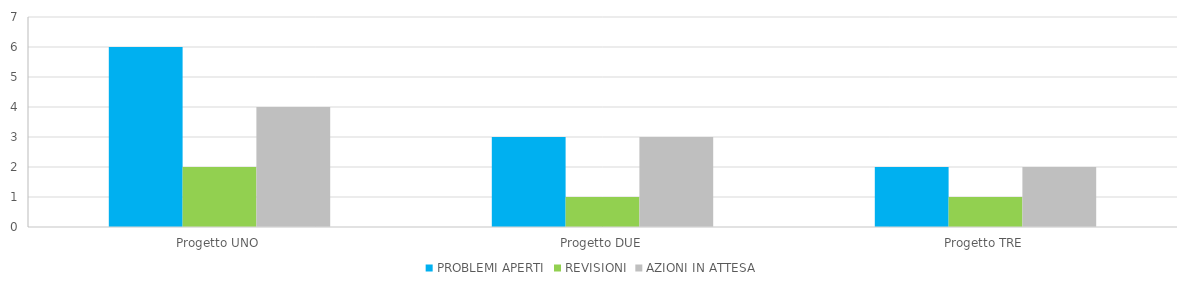
| Category | PROBLEMI APERTI | REVISIONI | AZIONI IN ATTESA |
|---|---|---|---|
| Progetto UNO | 6 | 2 | 4 |
| Progetto DUE | 3 | 1 | 3 |
| Progetto TRE | 2 | 1 | 2 |